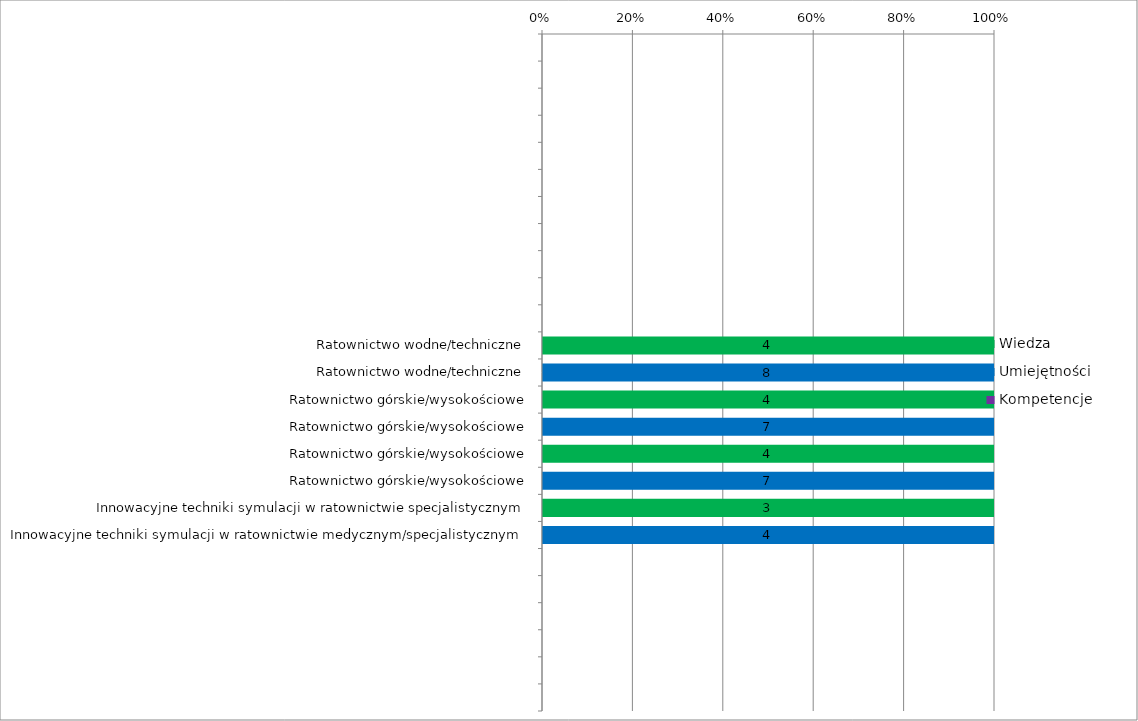
| Category | Wiedza | Umiejętności | Kompetencje |
|---|---|---|---|
|  | 0 | 0 | 0 |
|  | 0 | 0 | 0 |
|  | 0 | 0 | 0 |
|  | 0 | 0 | 0 |
|  | 0 | 0 | 0 |
|  | 0 | 0 | 0 |
|  | 0 | 0 | 0 |
|  | 0 | 0 | 0 |
|  | 0 | 0 | 0 |
|  | 0 | 0 | 0 |
|  | 0 | 0 | 0 |
| Ratownictwo wodne/techniczne | 4 | 0 | 0 |
| Ratownictwo wodne/techniczne | 0 | 8 | 0 |
| Ratownictwo górskie/wysokościowe | 4 | 0 | 0 |
| Ratownictwo górskie/wysokościowe | 0 | 7 | 0 |
| Ratownictwo górskie/wysokościowe | 4 | 0 | 0 |
| Ratownictwo górskie/wysokościowe | 0 | 7 | 0 |
| Innowacyjne techniki symulacji w ratownictwie specjalistycznym | 3 | 0 | 0 |
| Innowacyjne techniki symulacji w ratownictwie medycznym/specjalistycznym | 0 | 4 | 0 |